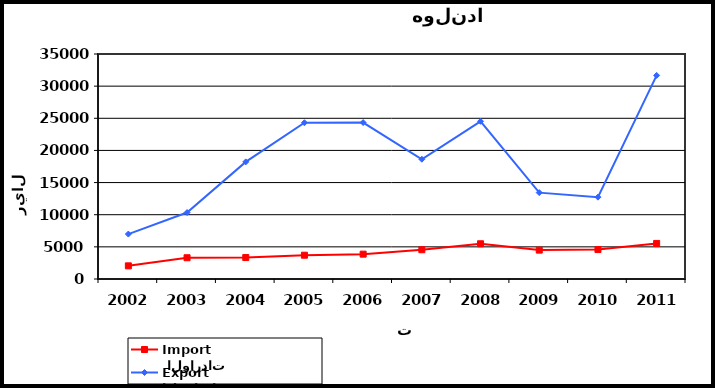
| Category |  الواردات           Import | الصادرات          Export |
|---|---|---|
| 2002.0 | 2045 | 6989 |
| 2003.0 | 3306 | 10338 |
| 2004.0 | 3338 | 18216 |
| 2005.0 | 3703 | 24308 |
| 2006.0 | 3865 | 24331 |
| 2007.0 | 4552 | 18630 |
| 2008.0 | 5479 | 24529 |
| 2009.0 | 4494 | 13436 |
| 2010.0 | 4582 | 12730 |
| 2011.0 | 5534 | 31667 |